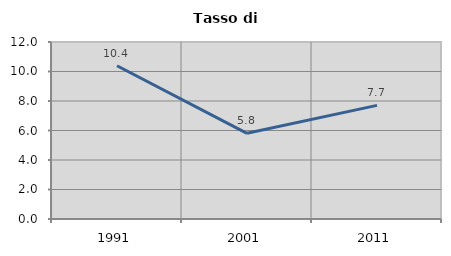
| Category | Tasso di disoccupazione   |
|---|---|
| 1991.0 | 10.39 |
| 2001.0 | 5.808 |
| 2011.0 | 7.703 |